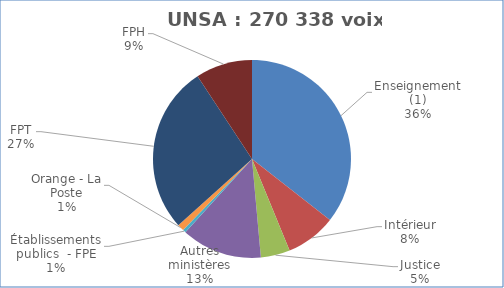
| Category | Nombre de voix |
|---|---|
| Enseignement (1) | 96174 |
| Intérieur | 22245 |
| Justice | 12888 |
| Autres ministères | 35600.8 |
| Établissements publics  - FPE | 1407.5 |
| Orange - La Poste | 2967.1 |
| FPT | 74005 |
| FPH | 25051 |